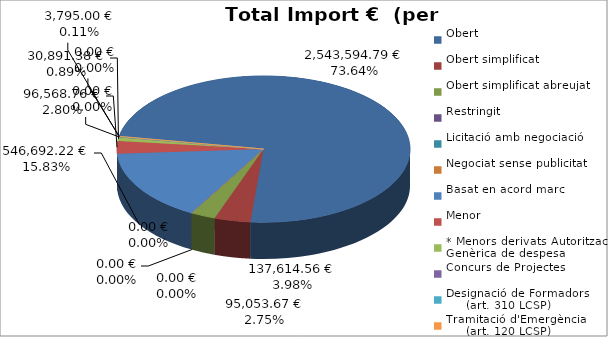
| Category | Total preu
(amb IVA) |
|---|---|
| Obert | 2543594.79 |
| Obert simplificat | 137614.56 |
| Obert simplificat abreujat | 95053.67 |
| Restringit | 0 |
| Licitació amb negociació | 0 |
| Negociat sense publicitat | 0 |
| Basat en acord marc | 546692.22 |
| Menor | 96568.76 |
| * Menors derivats Autorització Genèrica de despesa | 30891.38 |
| Concurs de Projectes | 0 |
| Designació de Formadors
     (art. 310 LCSP) | 3795 |
| Tramitació d'Emergència
     (art. 120 LCSP) | 0 |